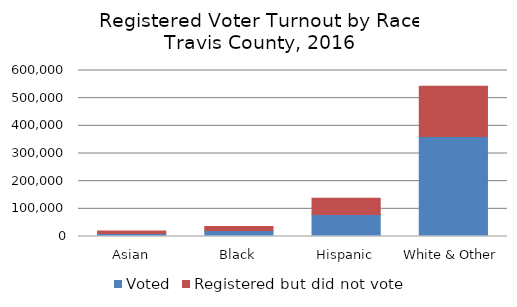
| Category | Voted | Registered but did not vote |
|---|---|---|
| Asian | 10734 | 8702 |
| Black | 21963 | 14493 |
| Hispanic | 79520 | 58509 |
| White & Other | 361786 | 181550 |